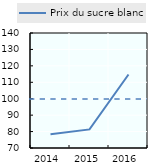
| Category | Prix du sucre blanc |
|---|---|
| 2014.0 | 78.386 |
| 2015.0 | 81.318 |
| 2016.0 | 114.733 |